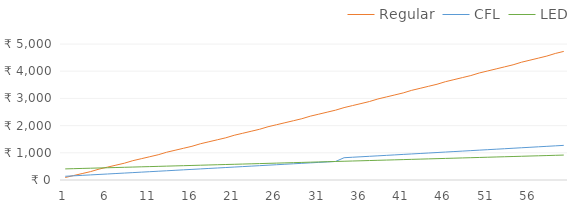
| Category | Regular | CFL | LED |
|---|---|---|---|
| 1.0 | 92 | 136.8 | 408.4 |
| 2.0 | 164.06 | 153.614 | 416.807 |
| 3.0 | 236.18 | 170.442 | 425.221 |
| 4.0 | 308.36 | 187.284 | 433.642 |
| 5.0 | 400.601 | 204.14 | 442.07 |
| 6.0 | 472.901 | 221.01 | 450.505 |
| 7.0 | 545.262 | 237.894 | 458.947 |
| 8.0 | 617.683 | 254.793 | 467.396 |
| 9.0 | 710.164 | 271.705 | 475.852 |
| 10.0 | 782.706 | 288.631 | 484.316 |
| 11.0 | 855.308 | 305.572 | 492.786 |
| 12.0 | 927.971 | 322.527 | 501.263 |
| 13.0 | 1020.694 | 339.495 | 509.748 |
| 14.0 | 1093.478 | 356.478 | 518.239 |
| 15.0 | 1166.323 | 373.475 | 526.738 |
| 16.0 | 1239.228 | 390.487 | 535.243 |
| 17.0 | 1332.194 | 407.512 | 543.756 |
| 18.0 | 1405.221 | 424.552 | 552.276 |
| 19.0 | 1478.309 | 441.605 | 560.803 |
| 20.0 | 1551.457 | 458.673 | 569.337 |
| 21.0 | 1644.667 | 475.756 | 577.878 |
| 22.0 | 1717.937 | 492.852 | 586.426 |
| 23.0 | 1791.269 | 509.963 | 594.981 |
| 24.0 | 1864.662 | 527.088 | 603.544 |
| 25.0 | 1958.116 | 544.227 | 612.113 |
| 26.0 | 2031.631 | 561.38 | 620.69 |
| 27.0 | 2105.207 | 578.548 | 629.274 |
| 28.0 | 2178.845 | 595.73 | 637.865 |
| 29.0 | 2252.544 | 612.927 | 646.463 |
| 30.0 | 2346.304 | 630.138 | 655.069 |
| 31.0 | 2420.126 | 647.363 | 663.681 |
| 32.0 | 2494.01 | 664.602 | 672.301 |
| 33.0 | 2567.955 | 681.856 | 680.928 |
| 34.0 | 2661.961 | 819.124 | 689.562 |
| 35.0 | 2736.029 | 836.407 | 698.203 |
| 36.0 | 2810.159 | 853.704 | 706.852 |
| 37.0 | 2884.351 | 871.015 | 715.508 |
| 38.0 | 2978.605 | 888.341 | 724.171 |
| 39.0 | 3052.92 | 905.681 | 732.841 |
| 40.0 | 3127.298 | 923.036 | 741.518 |
| 41.0 | 3201.737 | 940.405 | 750.203 |
| 42.0 | 3296.239 | 957.789 | 758.895 |
| 43.0 | 3370.802 | 975.187 | 767.594 |
| 44.0 | 3445.428 | 992.6 | 776.3 |
| 45.0 | 3520.116 | 1010.027 | 785.014 |
| 46.0 | 3614.866 | 1027.469 | 793.734 |
| 47.0 | 3689.678 | 1044.925 | 802.462 |
| 48.0 | 3764.553 | 1062.396 | 811.198 |
| 49.0 | 3839.49 | 1079.881 | 819.941 |
| 50.0 | 3934.49 | 1097.381 | 828.69 |
| 51.0 | 4009.552 | 1114.895 | 837.448 |
| 52.0 | 4084.676 | 1132.424 | 846.212 |
| 53.0 | 4159.864 | 1149.968 | 854.984 |
| 54.0 | 4235.113 | 1167.526 | 863.763 |
| 55.0 | 4330.426 | 1185.099 | 872.55 |
| 56.0 | 4405.801 | 1202.687 | 881.344 |
| 57.0 | 4481.24 | 1220.289 | 890.145 |
| 58.0 | 4556.741 | 1237.906 | 898.953 |
| 59.0 | 4652.305 | 1255.538 | 907.769 |
| 60.0 | 4727.932 | 1273.184 | 916.592 |